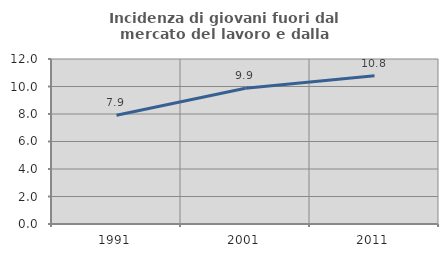
| Category | Incidenza di giovani fuori dal mercato del lavoro e dalla formazione  |
|---|---|
| 1991.0 | 7.914 |
| 2001.0 | 9.877 |
| 2011.0 | 10.784 |